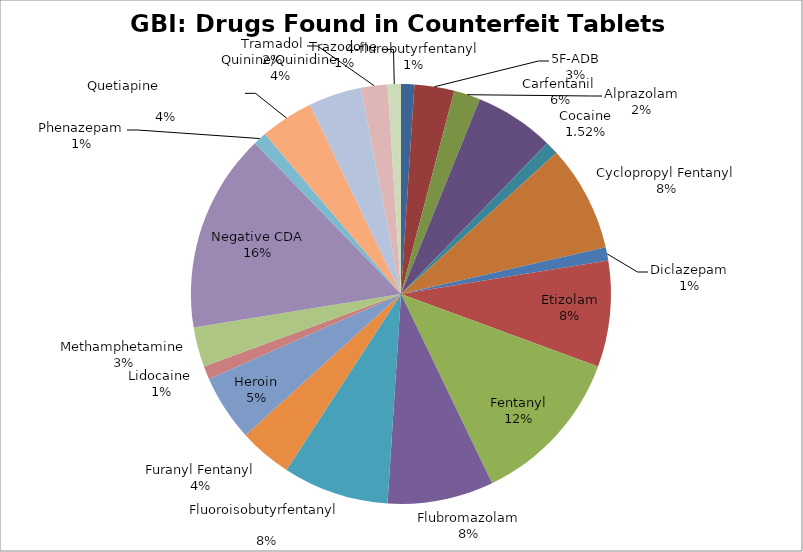
| Category | Series 0 |
|---|---|
| 4-flurobutyrfentanyl | 1 |
| 5F-ADB | 3 |
| Alprazolam | 2 |
| Carfentanil  | 6 |
| Cocaine | 1 |
| Cyclopropyl Fentanyl | 8 |
| Diclazepam | 1 |
| Etizolam | 8 |
| Fentanyl | 12 |
| Flubromazolam | 8 |
| Fluoroisobutyrfentanyl                                       | 8 |
| Furanyl Fentanyl | 4 |
| Heroin | 5 |
| Lidocaine  | 1 |
| Methamphetamine | 3 |
| Negative CDA | 15 |
| Phenazepam | 1 |
| Quetiapine                              | 4 |
| Quinine/Quinidine | 4 |
| Tramadol | 2 |
| Trazodone | 1 |